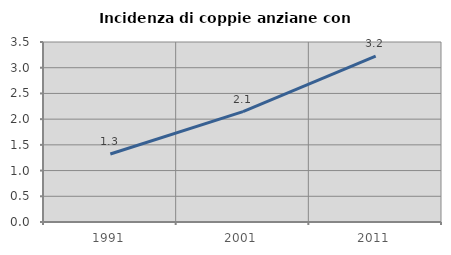
| Category | Incidenza di coppie anziane con figli |
|---|---|
| 1991.0 | 1.322 |
| 2001.0 | 2.147 |
| 2011.0 | 3.225 |